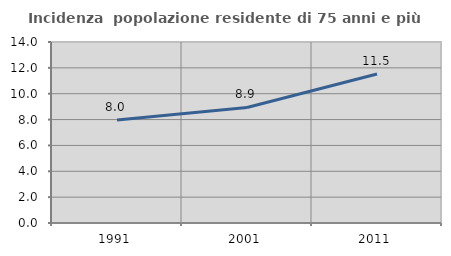
| Category | Incidenza  popolazione residente di 75 anni e più |
|---|---|
| 1991.0 | 7.975 |
| 2001.0 | 8.939 |
| 2011.0 | 11.522 |